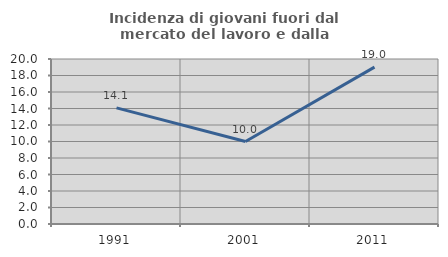
| Category | Incidenza di giovani fuori dal mercato del lavoro e dalla formazione  |
|---|---|
| 1991.0 | 14.07 |
| 2001.0 | 10 |
| 2011.0 | 19.014 |